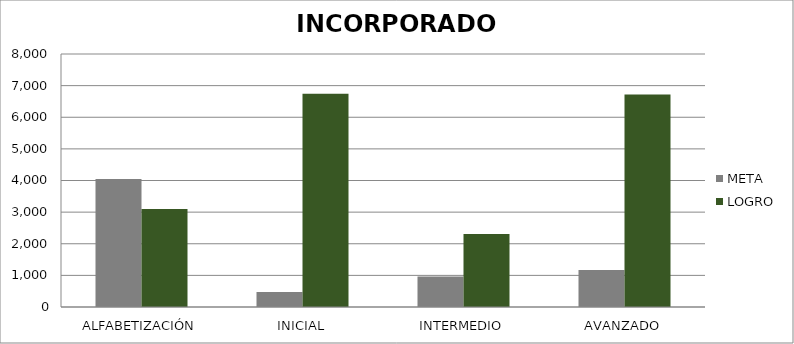
| Category | META | LOGRO |
|---|---|---|
| ALFABETIZACIÓN | 4047 | 3099 |
| INICIAL | 471 | 6747 |
| INTERMEDIO | 964 | 2306 |
| AVANZADO | 1171 | 6721 |